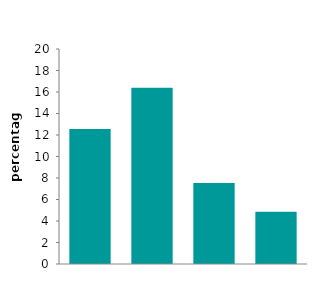
| Category | HHSRS |
|---|---|
| owner 
occupied | 12.556 |
| private 
rented | 16.402 |
| local 
authority | 7.545 |
| housing 
association | 4.849 |